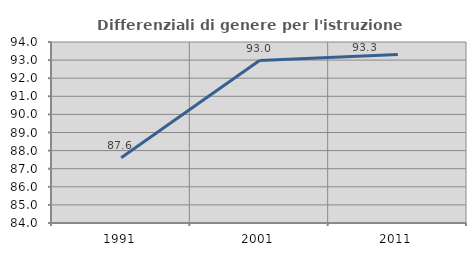
| Category | Differenziali di genere per l'istruzione superiore |
|---|---|
| 1991.0 | 87.605 |
| 2001.0 | 92.976 |
| 2011.0 | 93.31 |